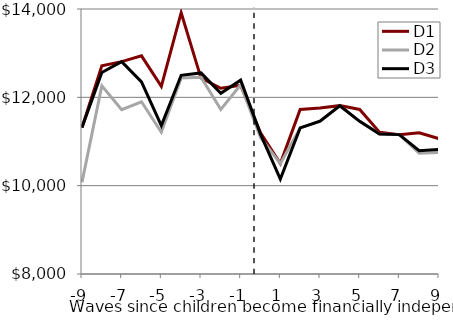
| Category | D1 | D2 | D3 |
|---|---|---|---|
| -9.0 | 11317 | 10079.28 | 11317.24 |
| -8.0 | 12714.89 | 12262.05 | 12564.08 |
| -7.0 | 12809.08 | 11718.86 | 12809.08 |
| -6.0 | 12939.85 | 11899.15 | 12348.03 |
| -5.0 | 12249.12 | 11210.58 | 11361.32 |
| -4.0 | 13915.69 | 12436.97 | 12498.35 |
| -3.0 | 12436.27 | 12456.2 | 12552.13 |
| -2.0 | 12205.69 | 11726.47 | 12091.5 |
| -1.0 | 12271.32 | 12283.95 | 12389.11 |
| 0.0 | 11196.44 | 11091.3 | 11166.91 |
| 1.0 | 10499.52 | 10499.25 | 10149.27 |
| 2.0 | 11726.47 | 11307.67 | 11307.67 |
| 3.0 | 11757.49 | 11455.61 | 11460 |
| 4.0 | 11811.96 | 11805.35 | 11810.51 |
| 5.0 | 11726.47 | 11455.61 | 11455.61 |
| 6.0 | 11210.58 | 11167.22 | 11170.24 |
| 7.0 | 11155.74 | 11155.74 | 11155.74 |
| 8.0 | 11196.44 | 10734.59 | 10790.22 |
| 9.0 | 11065.45 | 10753.26 | 10819.19 |